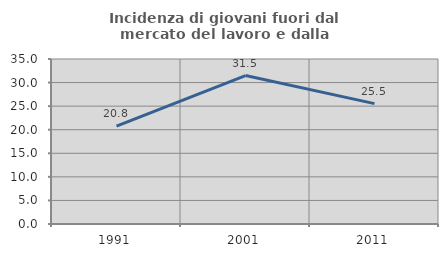
| Category | Incidenza di giovani fuori dal mercato del lavoro e dalla formazione  |
|---|---|
| 1991.0 | 20.771 |
| 2001.0 | 31.485 |
| 2011.0 | 25.528 |